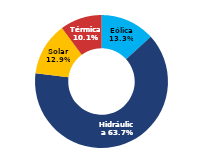
| Category | Sur |
|---|---|
| Eólica | 60.515 |
| Hidráulica | 290.477 |
| Solar | 58.62 |
| Térmica | 46.194 |